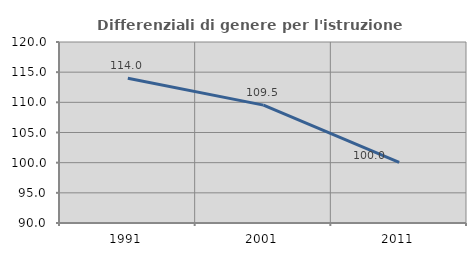
| Category | Differenziali di genere per l'istruzione superiore |
|---|---|
| 1991.0 | 113.986 |
| 2001.0 | 109.54 |
| 2011.0 | 100.033 |